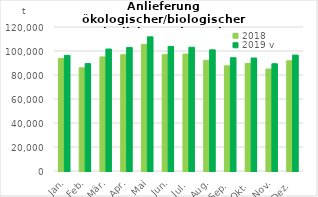
| Category | 2018 | 2019 v |
|---|---|---|
| Jan. | 93838.541 | 96300.384 |
| Feb. | 85997.268 | 89503.84 |
| Mär. | 95045.854 | 101631.768 |
| Apr. | 96908.391 | 103000.389 |
| Mai | 105453.392 | 111805.508 |
| Jun. | 96906.435 | 103856.721 |
| Jul. | 97411.701 | 103120.1 |
| Aug. | 92234.437 | 100970.96 |
| Sep. | 87638.685 | 94405.782 |
| Okt. | 89580.429 | 94157.376 |
| Nov. | 84970.128 | 89394.199 |
| Dez. | 91835.323 | 96594.992 |